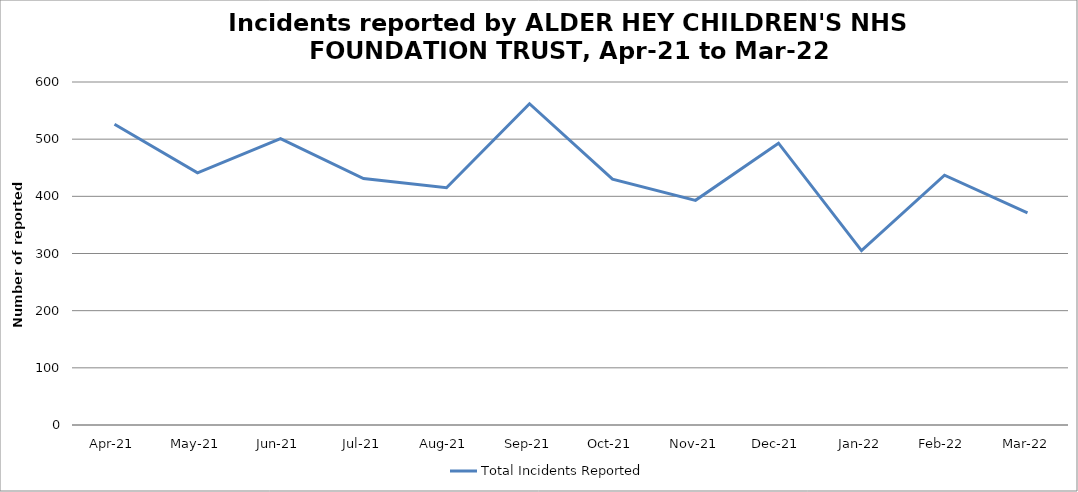
| Category | Total Incidents Reported |
|---|---|
| Apr-21 | 526 |
| May-21 | 441 |
| Jun-21 | 501 |
| Jul-21 | 431 |
| Aug-21 | 415 |
| Sep-21 | 562 |
| Oct-21 | 430 |
| Nov-21 | 393 |
| Dec-21 | 493 |
| Jan-22 | 305 |
| Feb-22 | 437 |
| Mar-22 | 371 |